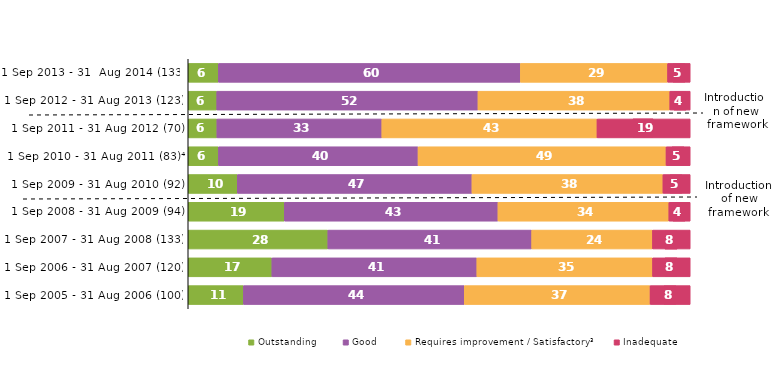
| Category | Outstanding | Good | Requires improvement / Satisfactory³ | Inadequate |
|---|---|---|---|---|
| 1 Sep 2013 - 31  Aug 2014 (133) | 6.015 | 60.15 | 29.323 | 4.511 |
| 1 Sep 2012 - 31 Aug 2013 (123) | 5.691 | 52.033 | 38.211 | 4.065 |
| 1 Sep 2011 - 31 Aug 2012 (70) | 5.714 | 32.857 | 42.857 | 18.571 |
| 1 Sep 2010 - 31 Aug 2011 (83)⁴ | 6.024 | 39.759 | 49.398 | 4.819 |
| 1 Sep 2009 - 31 Aug 2010 (92) | 9.783 | 46.739 | 38.043 | 5.435 |
| 1 Sep 2008 - 31 Aug 2009 (94) | 19.149 | 42.553 | 34.043 | 4.255 |
| 1 Sep 2007 - 31 Aug 2008 (133) | 27.82 | 40.602 | 24.06 | 7.519 |
| 1 Sep 2006 - 31 Aug 2007 (120) | 16.667 | 40.833 | 35 | 7.5 |
| 1 Sep 2005 - 31 Aug 2006 (100) | 11 | 44 | 37 | 8 |